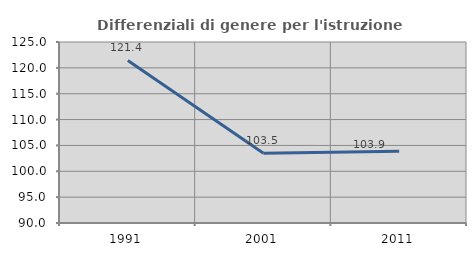
| Category | Differenziali di genere per l'istruzione superiore |
|---|---|
| 1991.0 | 121.439 |
| 2001.0 | 103.495 |
| 2011.0 | 103.865 |